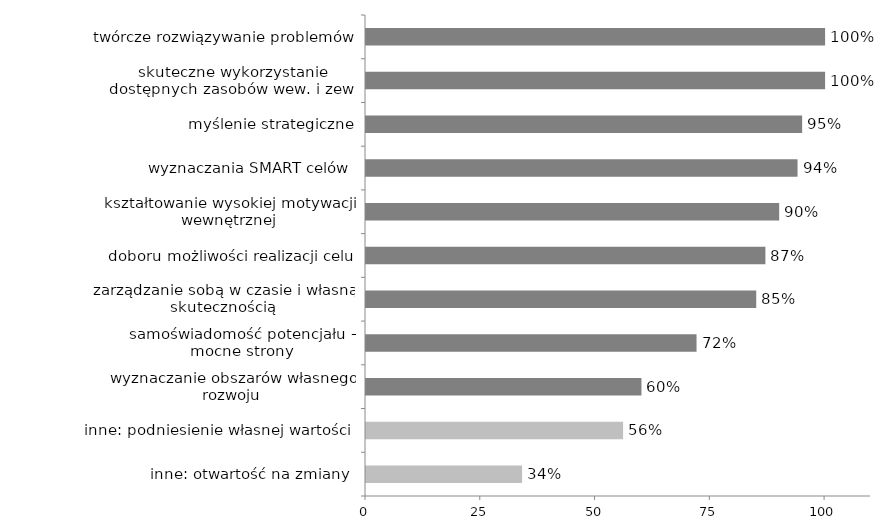
| Category | Series 0 |
|---|---|
| inne: otwartość na zmiany  | 34 |
| inne: podniesienie własnej wartości  | 56 |
| wyznaczanie obszarów własnego rozwoju | 60 |
| samoświadomość potencjału – mocne strony | 72 |
| zarządzanie sobą w czasie i własną skutecznością | 85 |
| doboru możliwości realizacji celu | 87 |
| kształtowanie wysokiej motywacji wewnętrznej | 90 |
| wyznaczania SMART celów  | 94 |
| myślenie strategiczne | 95 |
| skuteczne wykorzystanie dostępnych zasobów wew. i zew. | 100 |
| twórcze rozwiązywanie problemów | 100 |